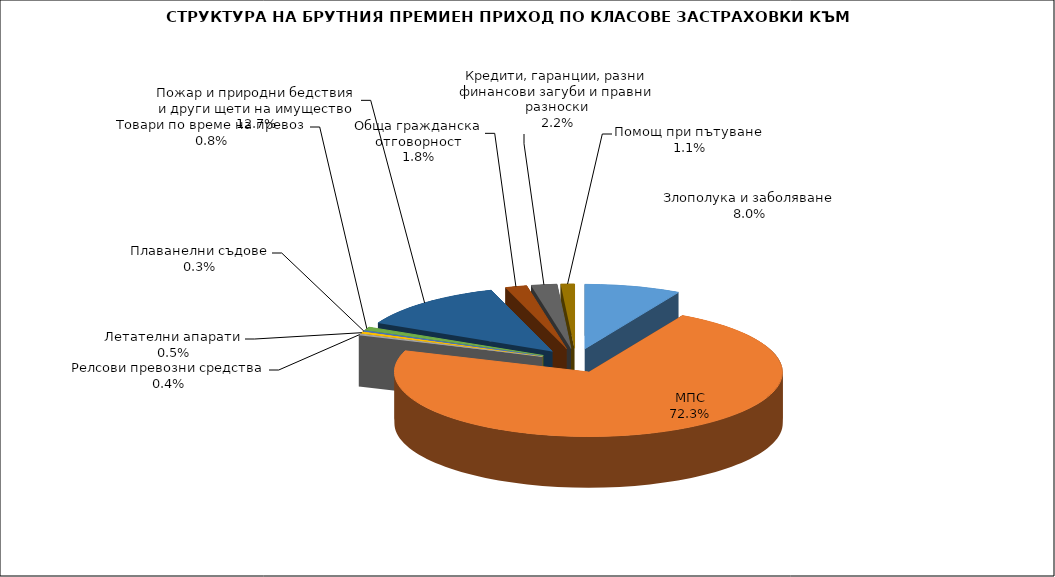
| Category | Злополука и заболяване |
|---|---|
| Злополука и заболяване | 0.08 |
| МПС | 0.723 |
| Релсови превозни средства | 0.004 |
| Летателни апарати | 0.005 |
| Плаванелни съдове | 0.003 |
| Товари по време на превоз | 0.008 |
| Пожар и природни бедствия и други щети на имущество | 0.127 |
| Обща гражданска отговорност | 0.018 |
| Кредити, гаранции, разни финансови загуби и правни разноски | 0.022 |
| Помощ при пътуване | 0.011 |